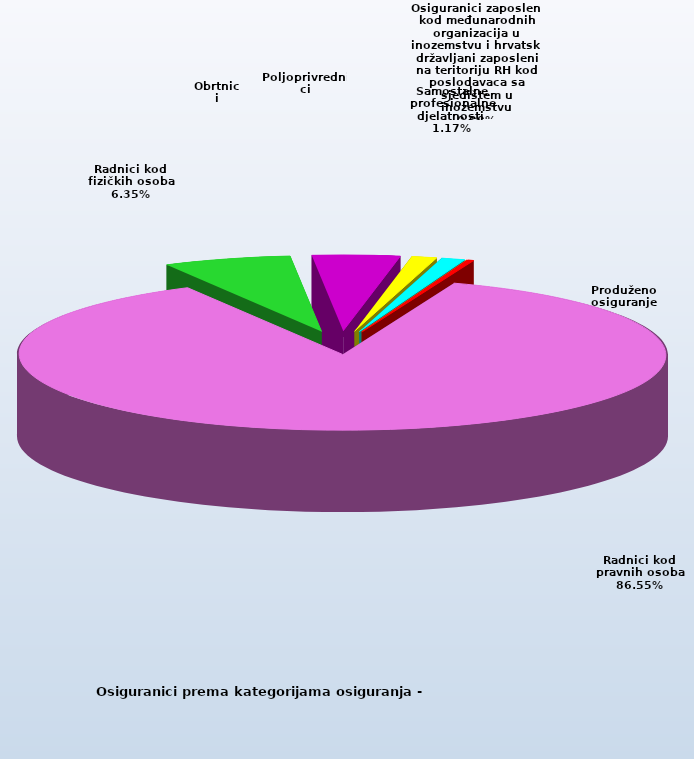
| Category | Series 0 |
|---|---|
| Radnici kod pravnih osoba | 1325635 |
| Radnici kod fizičkih osoba | 97334 |
| Obrtnici | 66677 |
| Poljoprivrednici | 19181 |
| Samostalne profesionalne djelatnosti  | 17982 |
| Osiguranici zaposleni kod međunarodnih organizacija u inozemstvu i hrvatski državljani zaposleni na teritoriju RH kod poslodavaca sa sjedištem u inozemstvu | 73 |
| Produženo osiguranje | 4807 |